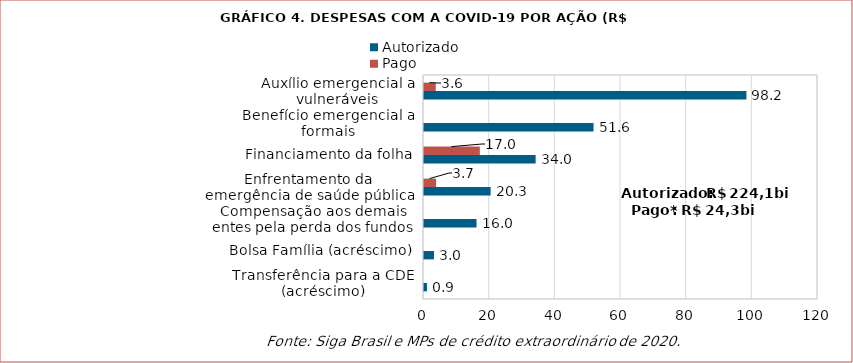
| Category | Autorizado | Pago |
|---|---|---|
| Transferência para a CDE (acréscimo) | 0.9 | 0 |
| Bolsa Família (acréscimo) | 3.038 | 0 |
| Compensação aos demais entes pela perda dos fundos de participação | 16 | 0 |
| Enfrentamento da emergência de saúde pública | 20.29 | 3.692 |
| Financiamento da folha | 34 | 17 |
| Benefício emergencial a formais | 51.642 | 0 |
| Auxílio emergencial a vulneráveis | 98.2 | 3.583 |